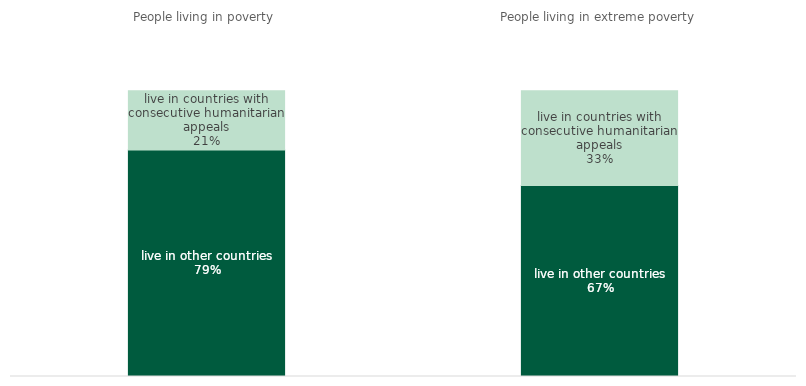
| Category | live in other countries | live in countries with consecutive humanitarian appeals |
|---|---|---|
| People living in poverty | 0.792 | 0.208 |
| People living in extreme poverty | 0.668 | 0.332 |